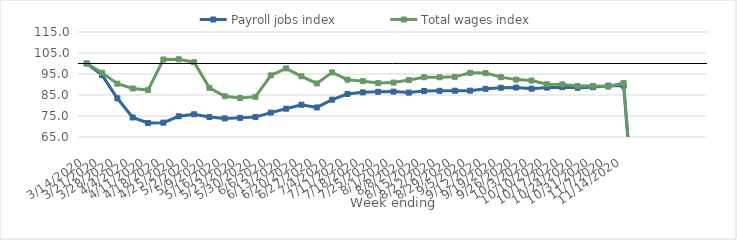
| Category | Payroll jobs index | Total wages index |
|---|---|---|
| 14/03/2020 | 100 | 100 |
| 21/03/2020 | 94.45 | 95.615 |
| 28/03/2020 | 83.429 | 90.381 |
| 04/04/2020 | 74.292 | 88.098 |
| 11/04/2020 | 71.686 | 87.329 |
| 18/04/2020 | 71.831 | 101.916 |
| 25/04/2020 | 74.866 | 102.011 |
| 02/05/2020 | 75.818 | 100.633 |
| 09/05/2020 | 74.526 | 88.399 |
| 16/05/2020 | 73.844 | 84.424 |
| 23/05/2020 | 74.107 | 83.579 |
| 30/05/2020 | 74.488 | 84.133 |
| 06/06/2020 | 76.612 | 94.352 |
| 13/06/2020 | 78.47 | 97.675 |
| 20/06/2020 | 80.369 | 93.913 |
| 27/06/2020 | 79.069 | 90.506 |
| 04/07/2020 | 82.777 | 95.765 |
| 11/07/2020 | 85.47 | 92.293 |
| 18/07/2020 | 86.261 | 91.605 |
| 25/07/2020 | 86.535 | 90.672 |
| 01/08/2020 | 86.616 | 90.913 |
| 08/08/2020 | 86.141 | 92.117 |
| 15/08/2020 | 86.898 | 93.458 |
| 22/08/2020 | 86.981 | 93.436 |
| 29/08/2020 | 87.052 | 93.646 |
| 05/09/2020 | 87.07 | 95.572 |
| 12/09/2020 | 87.927 | 95.425 |
| 19/09/2020 | 88.453 | 93.499 |
| 26/09/2020 | 88.568 | 92.326 |
| 03/10/2020 | 88.008 | 91.882 |
| 10/10/2020 | 88.524 | 90.126 |
| 17/10/2020 | 88.722 | 90.06 |
| 24/10/2020 | 88.438 | 89.293 |
| 31/10/2020 | 88.692 | 89.362 |
| 07/11/2020 | 89.44 | 88.963 |
| 14/11/2020 | 89.414 | 90.724 |